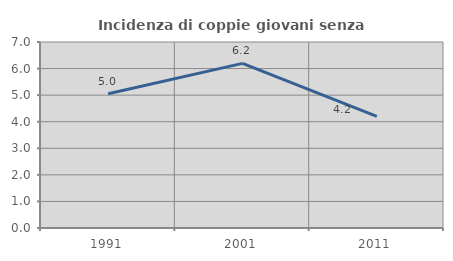
| Category | Incidenza di coppie giovani senza figli |
|---|---|
| 1991.0 | 5.049 |
| 2001.0 | 6.195 |
| 2011.0 | 4.204 |